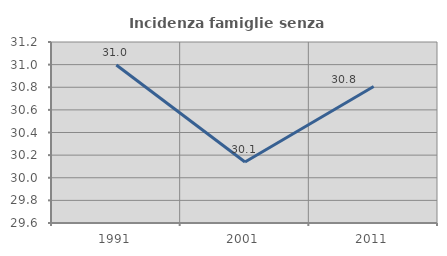
| Category | Incidenza famiglie senza nuclei |
|---|---|
| 1991.0 | 30.997 |
| 2001.0 | 30.14 |
| 2011.0 | 30.807 |